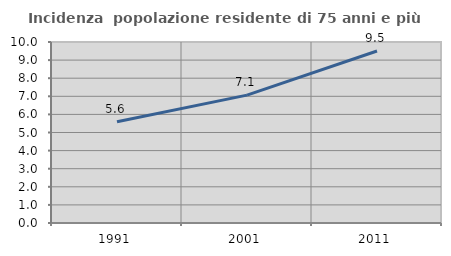
| Category | Incidenza  popolazione residente di 75 anni e più |
|---|---|
| 1991.0 | 5.593 |
| 2001.0 | 7.066 |
| 2011.0 | 9.502 |